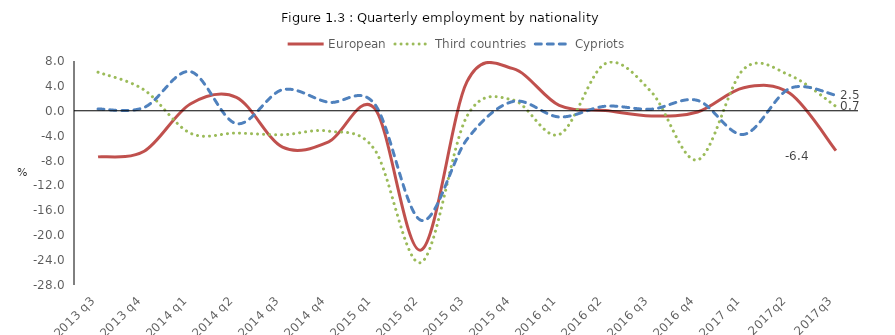
| Category | European | Third countries |
|---|---|---|
| 2013 q3 | -7.407 | 6.199 |
| 2013 q4 | -6.497 | 3.344 |
| 2014 q1 | 1.1 | -3.6 |
| 2014 q2 | 2.166 | -3.585 |
| 2014 q3 | -5.852 | -3.846 |
| 2014 q4 | -4.99 | -3.269 |
| 2015 q1 | 0.357 | -6.28 |
| 2015 q2 | -22.4 | -24.4 |
| 2015 q3 | 4.677 | -0.86 |
| 2015 q4 | 6.772 | 1.731 |
| 2016 q1 | 0.854 | -3.815 |
| 2016 q2 | 0.049 | 7.584 |
| 2016 q3 | -0.835 | 3.003 |
| 2016 q4 | -0.194 | -7.9 |
| 2017 q1 | 3.7 | 6.7 |
| 2017q2 | 2.8 | 5.7 |
| 2017q3 | -6.4 | 0.7 |